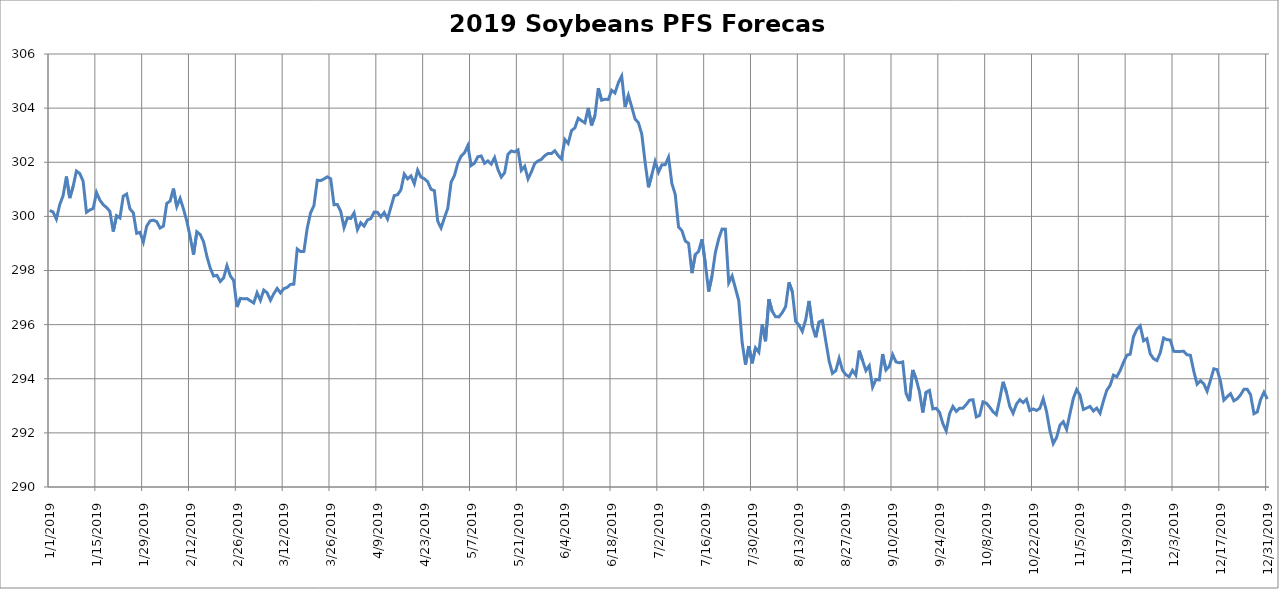
| Category | 2019 Soybeans PFS Forecas Model |
|---|---|
| 01/01/2019 | 300.221 |
| 02/01/2019 | 300.163 |
| 03/01/2019 | 299.9 |
| 04/01/2019 | 300.432 |
| 05/01/2019 | 300.759 |
| 06/01/2019 | 301.472 |
| 07/01/2019 | 300.675 |
| 08/01/2019 | 301.101 |
| 09/01/2019 | 301.675 |
| 10/01/2019 | 301.583 |
| 11/01/2019 | 301.3 |
| 12/01/2019 | 300.152 |
| 13/01/2019 | 300.236 |
| 14/01/2019 | 300.29 |
| 15/01/2019 | 300.883 |
| 16/01/2019 | 300.602 |
| 17/01/2019 | 300.43 |
| 18/01/2019 | 300.328 |
| 19/01/2019 | 300.185 |
| 20/01/2019 | 299.44 |
| 21/01/2019 | 300.026 |
| 22/01/2019 | 299.945 |
| 23/01/2019 | 300.748 |
| 24/01/2019 | 300.824 |
| 25/01/2019 | 300.273 |
| 26/01/2019 | 300.134 |
| 27/01/2019 | 299.374 |
| 28/01/2019 | 299.411 |
| 29/01/2019 | 299.054 |
| 30/01/2019 | 299.636 |
| 31/01/2019 | 299.834 |
| 01/02/2019 | 299.861 |
| 02/02/2019 | 299.804 |
| 03/02/2019 | 299.568 |
| 04/02/2019 | 299.64 |
| 05/02/2019 | 300.478 |
| 06/02/2019 | 300.566 |
| 07/02/2019 | 301.027 |
| 08/02/2019 | 300.363 |
| 09/02/2019 | 300.663 |
| 10/02/2019 | 300.271 |
| 11/02/2019 | 299.822 |
| 12/02/2019 | 299.245 |
| 13/02/2019 | 298.586 |
| 14/02/2019 | 299.432 |
| 15/02/2019 | 299.329 |
| 16/02/2019 | 299.065 |
| 17/02/2019 | 298.522 |
| 18/02/2019 | 298.087 |
| 19/02/2019 | 297.795 |
| 20/02/2019 | 297.822 |
| 21/02/2019 | 297.596 |
| 22/02/2019 | 297.725 |
| 23/02/2019 | 298.177 |
| 24/02/2019 | 297.802 |
| 25/02/2019 | 297.632 |
| 26/02/2019 | 296.65 |
| 27/02/2019 | 296.969 |
| 28/02/2019 | 296.953 |
| 01/03/2019 | 296.962 |
| 02/03/2019 | 296.878 |
| 03/03/2019 | 296.799 |
| 04/03/2019 | 297.177 |
| 05/03/2019 | 296.899 |
| 06/03/2019 | 297.276 |
| 07/03/2019 | 297.177 |
| 08/03/2019 | 296.901 |
| 09/03/2019 | 297.143 |
| 10/03/2019 | 297.336 |
| 11/03/2019 | 297.172 |
| 12/03/2019 | 297.33 |
| 13/03/2019 | 297.375 |
| 14/03/2019 | 297.487 |
| 15/03/2019 | 297.495 |
| 16/03/2019 | 298.794 |
| 17/03/2019 | 298.699 |
| 18/03/2019 | 298.706 |
| 19/03/2019 | 299.569 |
| 20/03/2019 | 300.134 |
| 21/03/2019 | 300.399 |
| 22/03/2019 | 301.335 |
| 23/03/2019 | 301.32 |
| 24/03/2019 | 301.384 |
| 25/03/2019 | 301.462 |
| 26/03/2019 | 301.39 |
| 27/03/2019 | 300.43 |
| 28/03/2019 | 300.44 |
| 29/03/2019 | 300.184 |
| 30/03/2019 | 299.583 |
| 31/03/2019 | 299.942 |
| 01/04/2019 | 299.92 |
| 02/04/2019 | 300.128 |
| 03/04/2019 | 299.511 |
| 04/04/2019 | 299.768 |
| 05/04/2019 | 299.642 |
| 06/04/2019 | 299.868 |
| 07/04/2019 | 299.917 |
| 08/04/2019 | 300.159 |
| 09/04/2019 | 300.148 |
| 10/04/2019 | 299.982 |
| 11/04/2019 | 300.144 |
| 12/04/2019 | 299.902 |
| 13/04/2019 | 300.34 |
| 14/04/2019 | 300.768 |
| 15/04/2019 | 300.799 |
| 16/04/2019 | 300.982 |
| 17/04/2019 | 301.564 |
| 18/04/2019 | 301.387 |
| 19/04/2019 | 301.496 |
| 20/04/2019 | 301.204 |
| 21/04/2019 | 301.707 |
| 22/04/2019 | 301.452 |
| 23/04/2019 | 301.393 |
| 24/04/2019 | 301.28 |
| 25/04/2019 | 301.001 |
| 26/04/2019 | 300.952 |
| 27/04/2019 | 299.824 |
| 28/04/2019 | 299.569 |
| 29/04/2019 | 299.944 |
| 30/04/2019 | 300.296 |
| 01/05/2019 | 301.259 |
| 02/05/2019 | 301.511 |
| 03/05/2019 | 301.962 |
| 04/05/2019 | 302.228 |
| 05/05/2019 | 302.35 |
| 06/05/2019 | 302.616 |
| 07/05/2019 | 301.88 |
| 08/05/2019 | 301.967 |
| 09/05/2019 | 302.203 |
| 10/05/2019 | 302.233 |
| 11/05/2019 | 301.961 |
| 12/05/2019 | 302.049 |
| 13/05/2019 | 301.932 |
| 14/05/2019 | 302.173 |
| 15/05/2019 | 301.733 |
| 16/05/2019 | 301.454 |
| 17/05/2019 | 301.611 |
| 18/05/2019 | 302.296 |
| 19/05/2019 | 302.415 |
| 20/05/2019 | 302.383 |
| 21/05/2019 | 302.458 |
| 22/05/2019 | 301.701 |
| 23/05/2019 | 301.85 |
| 24/05/2019 | 301.385 |
| 25/05/2019 | 301.644 |
| 26/05/2019 | 301.955 |
| 27/05/2019 | 302.048 |
| 28/05/2019 | 302.107 |
| 29/05/2019 | 302.245 |
| 30/05/2019 | 302.324 |
| 31/05/2019 | 302.322 |
| 01/06/2019 | 302.425 |
| 02/06/2019 | 302.248 |
| 03/06/2019 | 302.121 |
| 04/06/2019 | 302.84 |
| 05/06/2019 | 302.697 |
| 06/06/2019 | 303.171 |
| 07/06/2019 | 303.269 |
| 08/06/2019 | 303.628 |
| 09/06/2019 | 303.534 |
| 10/06/2019 | 303.456 |
| 11/06/2019 | 304.008 |
| 12/06/2019 | 303.361 |
| 13/06/2019 | 303.726 |
| 14/06/2019 | 304.736 |
| 15/06/2019 | 304.293 |
| 16/06/2019 | 304.327 |
| 17/06/2019 | 304.319 |
| 18/06/2019 | 304.659 |
| 19/06/2019 | 304.56 |
| 20/06/2019 | 304.94 |
| 21/06/2019 | 305.184 |
| 22/06/2019 | 304.038 |
| 23/06/2019 | 304.467 |
| 24/06/2019 | 304.043 |
| 25/06/2019 | 303.594 |
| 26/06/2019 | 303.462 |
| 27/06/2019 | 303.039 |
| 28/06/2019 | 301.997 |
| 29/06/2019 | 301.075 |
| 30/06/2019 | 301.531 |
| 01/07/2019 | 302.023 |
| 02/07/2019 | 301.634 |
| 03/07/2019 | 301.903 |
| 04/07/2019 | 301.903 |
| 05/07/2019 | 302.185 |
| 06/07/2019 | 301.21 |
| 07/07/2019 | 300.815 |
| 08/07/2019 | 299.603 |
| 09/07/2019 | 299.475 |
| 10/07/2019 | 299.09 |
| 11/07/2019 | 299.003 |
| 12/07/2019 | 297.903 |
| 13/07/2019 | 298.589 |
| 14/07/2019 | 298.709 |
| 15/07/2019 | 299.154 |
| 16/07/2019 | 298.247 |
| 17/07/2019 | 297.222 |
| 18/07/2019 | 297.808 |
| 19/07/2019 | 298.664 |
| 20/07/2019 | 299.172 |
| 21/07/2019 | 299.531 |
| 22/07/2019 | 299.527 |
| 23/07/2019 | 297.548 |
| 24/07/2019 | 297.796 |
| 25/07/2019 | 297.343 |
| 26/07/2019 | 296.88 |
| 27/07/2019 | 295.336 |
| 28/07/2019 | 294.521 |
| 29/07/2019 | 295.208 |
| 30/07/2019 | 294.571 |
| 31/07/2019 | 295.143 |
| 01/08/2019 | 294.982 |
| 02/08/2019 | 296.013 |
| 03/08/2019 | 295.386 |
| 04/08/2019 | 296.939 |
| 05/08/2019 | 296.49 |
| 06/08/2019 | 296.291 |
| 07/08/2019 | 296.285 |
| 08/08/2019 | 296.444 |
| 09/08/2019 | 296.665 |
| 10/08/2019 | 297.561 |
| 11/08/2019 | 297.224 |
| 12/08/2019 | 296.125 |
| 13/08/2019 | 295.981 |
| 14/08/2019 | 295.751 |
| 15/08/2019 | 296.18 |
| 16/08/2019 | 296.876 |
| 17/08/2019 | 295.946 |
| 18/08/2019 | 295.531 |
| 19/08/2019 | 296.099 |
| 20/08/2019 | 296.15 |
| 21/08/2019 | 295.398 |
| 22/08/2019 | 294.655 |
| 23/08/2019 | 294.2 |
| 24/08/2019 | 294.299 |
| 25/08/2019 | 294.754 |
| 26/08/2019 | 294.316 |
| 27/08/2019 | 294.15 |
| 28/08/2019 | 294.075 |
| 29/08/2019 | 294.31 |
| 30/08/2019 | 294.13 |
| 31/08/2019 | 295.038 |
| 01/09/2019 | 294.67 |
| 02/09/2019 | 294.3 |
| 03/09/2019 | 294.48 |
| 04/09/2019 | 293.692 |
| 05/09/2019 | 293.975 |
| 06/09/2019 | 293.955 |
| 07/09/2019 | 294.912 |
| 08/09/2019 | 294.326 |
| 09/09/2019 | 294.458 |
| 10/09/2019 | 294.892 |
| 11/09/2019 | 294.622 |
| 12/09/2019 | 294.588 |
| 13/09/2019 | 294.623 |
| 14/09/2019 | 293.46 |
| 15/09/2019 | 293.176 |
| 16/09/2019 | 294.323 |
| 17/09/2019 | 294 |
| 18/09/2019 | 293.527 |
| 19/09/2019 | 292.752 |
| 20/09/2019 | 293.502 |
| 21/09/2019 | 293.569 |
| 22/09/2019 | 292.884 |
| 23/09/2019 | 292.909 |
| 24/09/2019 | 292.763 |
| 25/09/2019 | 292.346 |
| 26/09/2019 | 292.071 |
| 27/09/2019 | 292.702 |
| 28/09/2019 | 292.976 |
| 29/09/2019 | 292.793 |
| 30/09/2019 | 292.909 |
| 01/10/2019 | 292.911 |
| 02/10/2019 | 293.051 |
| 03/10/2019 | 293.209 |
| 04/10/2019 | 293.224 |
| 05/10/2019 | 292.59 |
| 06/10/2019 | 292.645 |
| 07/10/2019 | 293.147 |
| 08/10/2019 | 293.099 |
| 09/10/2019 | 292.953 |
| 10/10/2019 | 292.782 |
| 11/10/2019 | 292.672 |
| 12/10/2019 | 293.238 |
| 13/10/2019 | 293.888 |
| 14/10/2019 | 293.502 |
| 15/10/2019 | 292.98 |
| 16/10/2019 | 292.724 |
| 17/10/2019 | 293.061 |
| 18/10/2019 | 293.227 |
| 19/10/2019 | 293.12 |
| 20/10/2019 | 293.24 |
| 21/10/2019 | 292.824 |
| 22/10/2019 | 292.884 |
| 23/10/2019 | 292.828 |
| 24/10/2019 | 292.906 |
| 25/10/2019 | 293.261 |
| 26/10/2019 | 292.79 |
| 27/10/2019 | 292.086 |
| 28/10/2019 | 291.604 |
| 29/10/2019 | 291.829 |
| 30/10/2019 | 292.282 |
| 31/10/2019 | 292.412 |
| 01/11/2019 | 292.131 |
| 02/11/2019 | 292.713 |
| 03/11/2019 | 293.27 |
| 04/11/2019 | 293.6 |
| 05/11/2019 | 293.391 |
| 06/11/2019 | 292.864 |
| 07/11/2019 | 292.918 |
| 08/11/2019 | 292.978 |
| 09/11/2019 | 292.809 |
| 10/11/2019 | 292.914 |
| 11/11/2019 | 292.727 |
| 12/11/2019 | 293.176 |
| 13/11/2019 | 293.572 |
| 14/11/2019 | 293.755 |
| 15/11/2019 | 294.134 |
| 16/11/2019 | 294.073 |
| 17/11/2019 | 294.302 |
| 18/11/2019 | 294.604 |
| 19/11/2019 | 294.868 |
| 20/11/2019 | 294.91 |
| 21/11/2019 | 295.555 |
| 22/11/2019 | 295.828 |
| 23/11/2019 | 295.955 |
| 24/11/2019 | 295.403 |
| 25/11/2019 | 295.478 |
| 26/11/2019 | 294.917 |
| 27/11/2019 | 294.739 |
| 28/11/2019 | 294.673 |
| 29/11/2019 | 294.961 |
| 30/11/2019 | 295.509 |
| 01/12/2019 | 295.444 |
| 02/12/2019 | 295.43 |
| 03/12/2019 | 295.013 |
| 04/12/2019 | 295.008 |
| 05/12/2019 | 295.011 |
| 06/12/2019 | 295.014 |
| 07/12/2019 | 294.888 |
| 08/12/2019 | 294.867 |
| 09/12/2019 | 294.285 |
| 10/12/2019 | 293.799 |
| 11/12/2019 | 293.926 |
| 12/12/2019 | 293.812 |
| 13/12/2019 | 293.539 |
| 14/12/2019 | 293.943 |
| 15/12/2019 | 294.368 |
| 16/12/2019 | 294.337 |
| 17/12/2019 | 293.906 |
| 18/12/2019 | 293.211 |
| 19/12/2019 | 293.336 |
| 20/12/2019 | 293.448 |
| 21/12/2019 | 293.184 |
| 22/12/2019 | 293.259 |
| 23/12/2019 | 293.404 |
| 24/12/2019 | 293.609 |
| 25/12/2019 | 293.609 |
| 26/12/2019 | 293.406 |
| 27/12/2019 | 292.71 |
| 28/12/2019 | 292.776 |
| 29/12/2019 | 293.236 |
| 30/12/2019 | 293.499 |
| 31/12/2019 | 293.253 |